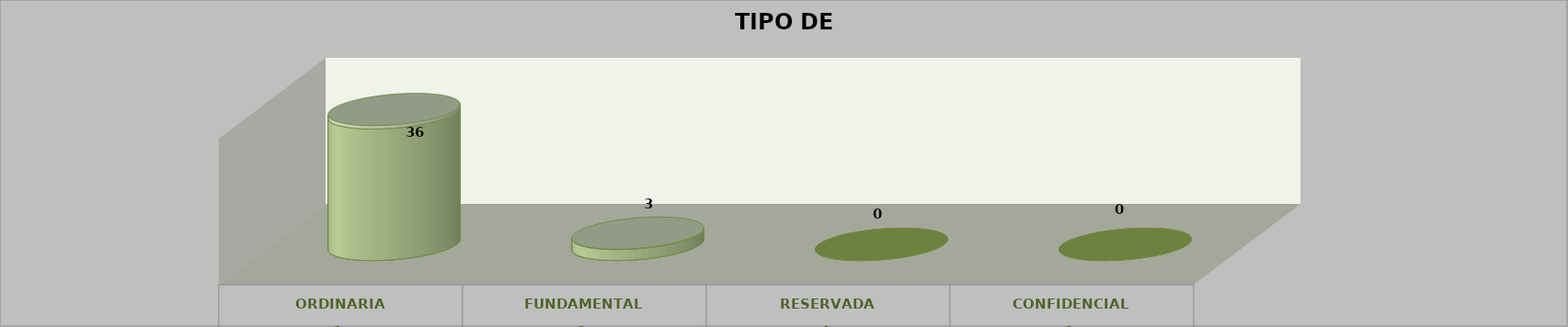
| Category | Series 0 | Series 2 | Series 1 | Series 3 | Series 4 |
|---|---|---|---|---|---|
| 0 |  |  |  | 36 | 0.923 |
| 1 |  |  |  | 3 | 0.077 |
| 2 |  |  |  | 0 | 0 |
| 3 |  |  |  | 0 | 0 |